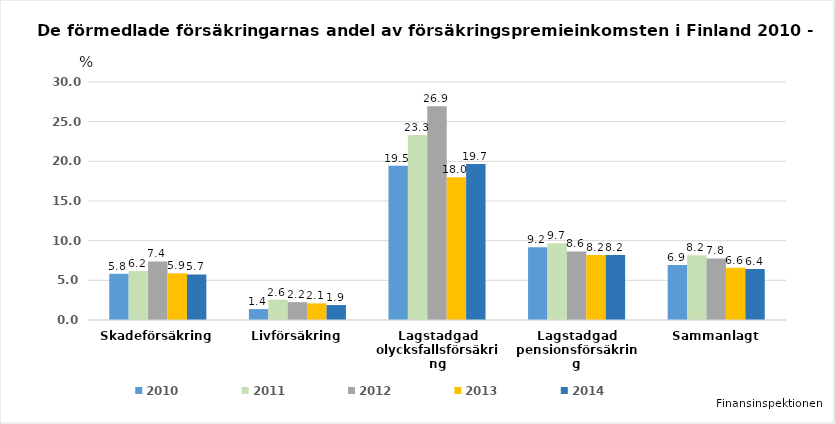
| Category | 2010 | 2011 | 2012 | 2013 | 2014 |
|---|---|---|---|---|---|
| Skadeförsäkring | 5.826 | 6.168 | 7.375 | 5.882 | 5.737 |
| Livförsäkring | 1.376 | 2.56 | 2.246 | 2.097 | 1.88 |
| Lagstadgad olycksfallsförsäkring | 19.457 | 23.324 | 26.944 | 17.98 | 19.654 |
| Lagstadgad pensionsförsäkring | 9.174 | 9.661 | 8.637 | 8.204 | 8.203 |
| Sammanlagt | 6.932 | 8.167 | 7.754 | 6.584 | 6.436 |